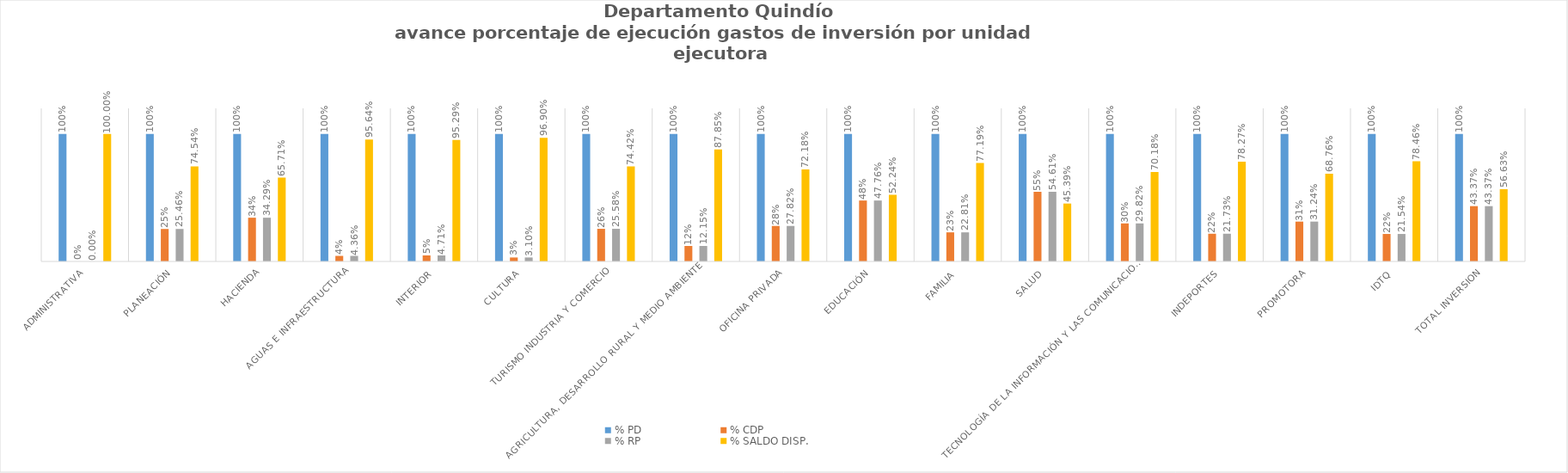
| Category | % PD | % CDP | % RP | % SALDO DISP. |
|---|---|---|---|---|
| Administrativa | 1 | 0 | 0 | 1 |
| Planeación | 1 | 0.255 | 0.255 | 0.745 |
| Hacienda | 1 | 0.343 | 0.343 | 0.657 |
| Aguas e Infraestructura | 1 | 0.044 | 0.044 | 0.956 |
| Interior | 1 | 0.047 | 0.047 | 0.953 |
| Cultura | 1 | 0.031 | 0.031 | 0.969 |
| Turismo Industria y Comercio | 1 | 0.256 | 0.256 | 0.744 |
| Agricultura, Desarrollo Rural y Medio Ambiente | 1 | 0.122 | 0.122 | 0.878 |
| Oficina Privada | 1 | 0.278 | 0.278 | 0.722 |
| Educación | 1 | 0.478 | 0.478 | 0.522 |
| Familia | 1 | 0.228 | 0.228 | 0.772 |
| Salud | 1 | 0.546 | 0.546 | 0.454 |
| Tecnología de la Información y las Comunicaciones | 1 | 0.298 | 0.298 | 0.702 |
| Indeportes | 1 | 0.217 | 0.217 | 0.783 |
| Promotora | 1 | 0.312 | 0.312 | 0.688 |
| IDTQ | 1 | 0.215 | 0.215 | 0.785 |
| TOTAL INVERSION | 1 | 0.434 | 0.434 | 0.566 |